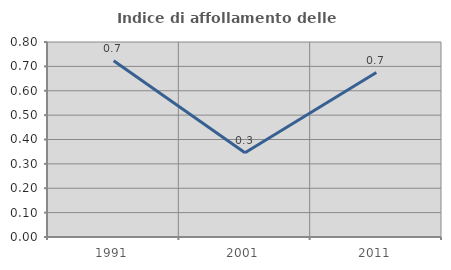
| Category | Indice di affollamento delle abitazioni  |
|---|---|
| 1991.0 | 0.723 |
| 2001.0 | 0.346 |
| 2011.0 | 0.675 |